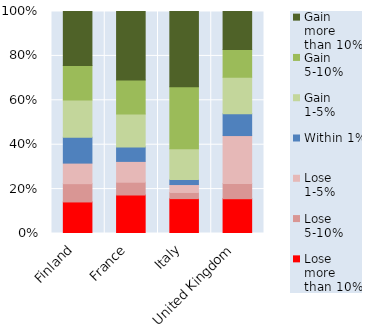
| Category | Lose more than 10% | Lose 5-10% | Lose 1-5% | Within 1% | Gain 1-5% | Gain 5-10% | Gain more than 10% |
|---|---|---|---|---|---|---|---|
| Finland | 14.21 | 8.24 | 9.26 | 11.66 | 16.72 | 15.55 | 24.36 |
| France  | 17.34 | 5.76 | 9.38 | 6.49 | 14.81 | 15.32 | 30.9 |
| Italy | 15.71 | 2.77 | 3.57 | 2.24 | 13.85 | 27.93 | 33.92 |
| United Kingdom | 15.67 | 6.83 | 21.62 | 9.82 | 16.45 | 12.46 | 17.16 |